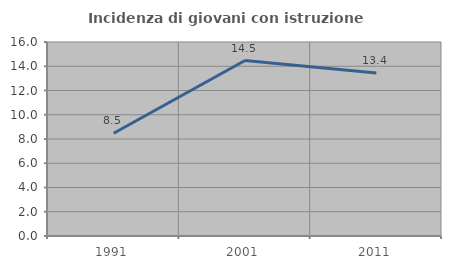
| Category | Incidenza di giovani con istruzione universitaria |
|---|---|
| 1991.0 | 8.475 |
| 2001.0 | 14.474 |
| 2011.0 | 13.445 |